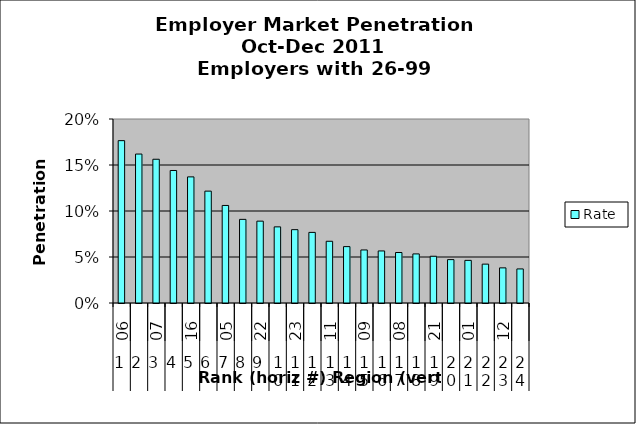
| Category | Rate |
|---|---|
| 0 | 0.176 |
| 1 | 0.162 |
| 2 | 0.156 |
| 3 | 0.144 |
| 4 | 0.137 |
| 5 | 0.122 |
| 6 | 0.106 |
| 7 | 0.091 |
| 8 | 0.089 |
| 9 | 0.083 |
| 10 | 0.08 |
| 11 | 0.077 |
| 12 | 0.067 |
| 13 | 0.061 |
| 14 | 0.058 |
| 15 | 0.057 |
| 16 | 0.055 |
| 17 | 0.053 |
| 18 | 0.051 |
| 19 | 0.047 |
| 20 | 0.046 |
| 21 | 0.042 |
| 22 | 0.038 |
| 23 | 0.037 |